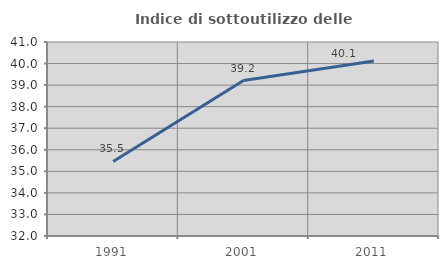
| Category | Indice di sottoutilizzo delle abitazioni  |
|---|---|
| 1991.0 | 35.457 |
| 2001.0 | 39.213 |
| 2011.0 | 40.119 |